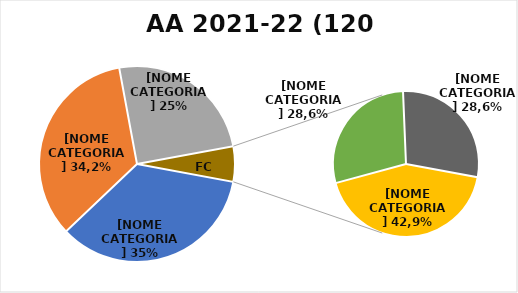
| Category | Series 0 |
|---|---|
| PRIMO ANNO | 42 |
| SECONDO ANNO | 41 |
| TERZO ANNO IC | 30 |
| FC 1 ANNO | 3 |
| FC 2 ANNI | 0 |
| FC 3 ANNI | 2 |
| FC 4 ANNI | 0 |
| FC 5 ANNI | 0 |
| FC 6 ANNI | 2 |